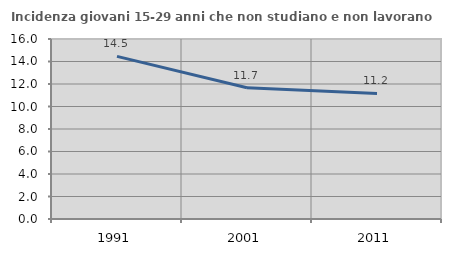
| Category | Incidenza giovani 15-29 anni che non studiano e non lavorano  |
|---|---|
| 1991.0 | 14.458 |
| 2001.0 | 11.666 |
| 2011.0 | 11.162 |